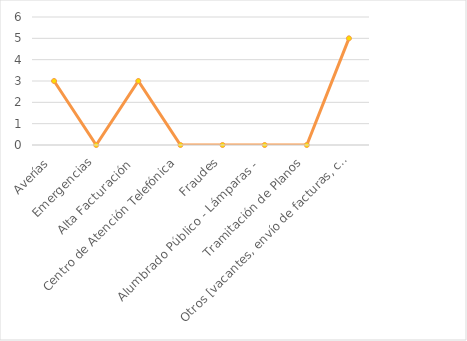
| Category | Series 0 | Series 1 | Series 2 | Series 3 | Series 4 | Series 5 |
|---|---|---|---|---|---|---|
| Averías |  |  |  |  |  | 3 |
| Emergencias |  |  |  |  |  | 0 |
| Alta Facturación  |  |  |  |  |  | 3 |
| Centro de Atención Telefónica |  |  |  |  |  | 0 |
| Fraudes |  |  |  |  |  | 0 |
| Alumbrado Público - Lámparas -  |  |  |  |  |  | 0 |
| Tramitación de Planos |  |  |  |  |  | 0 |
| Otros [vacantes, envío de facturas, consulta y orientación de servicios] |  |  |  |  |  | 5 |